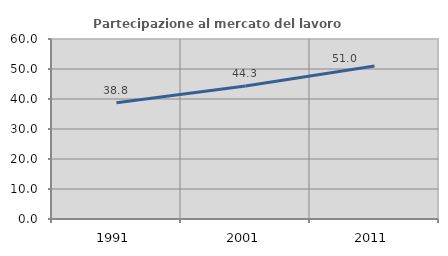
| Category | Partecipazione al mercato del lavoro  femminile |
|---|---|
| 1991.0 | 38.751 |
| 2001.0 | 44.323 |
| 2011.0 | 51.001 |